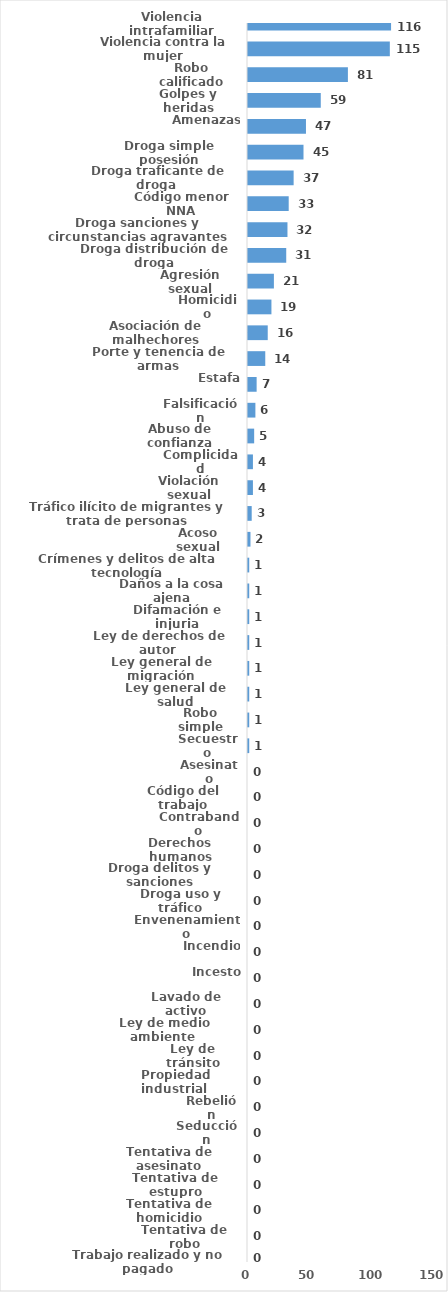
| Category | Series 0 |
|---|---|
| Violencia intrafamiliar | 116 |
| Violencia contra la mujer | 115 |
| Robo calificado | 81 |
| Golpes y heridas | 59 |
| Amenazas | 47 |
| Droga simple posesión | 45 |
| Droga traficante de droga  | 37 |
| Código menor NNA | 33 |
| Droga sanciones y circunstancias agravantes | 32 |
| Droga distribución de droga | 31 |
| Agresión sexual | 21 |
| Homicidio | 19 |
| Asociación de malhechores | 16 |
| Porte y tenencia de armas | 14 |
| Estafa | 7 |
| Falsificación | 6 |
| Abuso de confianza | 5 |
| Complicidad | 4 |
| Violación sexual | 4 |
| Tráfico ilícito de migrantes y trata de personas | 3 |
| Acoso sexual | 2 |
| Crímenes y delitos de alta tecnología | 1 |
| Daños a la cosa ajena | 1 |
| Difamación e injuria | 1 |
| Ley de derechos de autor  | 1 |
| Ley general de migración | 1 |
| Ley general de salud | 1 |
| Robo simple | 1 |
| Secuestro | 1 |
| Asesinato | 0 |
| Código del trabajo | 0 |
| Contrabando | 0 |
| Derechos humanos | 0 |
| Droga delitos y sanciones | 0 |
| Droga uso y tráfico | 0 |
| Envenenamiento | 0 |
| Incendio | 0 |
| Incesto | 0 |
| Lavado de activo | 0 |
| Ley de medio ambiente  | 0 |
| Ley de tránsito | 0 |
| Propiedad industrial  | 0 |
| Rebelión | 0 |
| Seducción | 0 |
| Tentativa de asesinato | 0 |
| Tentativa de estupro | 0 |
| Tentativa de homicidio | 0 |
| Tentativa de robo | 0 |
| Trabajo realizado y no pagado | 0 |